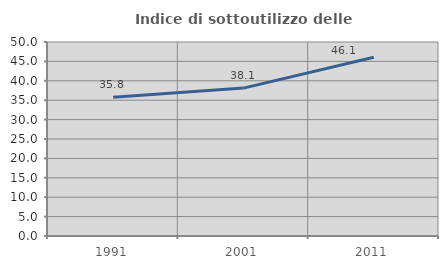
| Category | Indice di sottoutilizzo delle abitazioni  |
|---|---|
| 1991.0 | 35.776 |
| 2001.0 | 38.122 |
| 2011.0 | 46.067 |